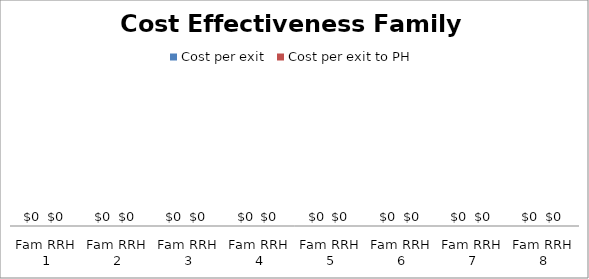
| Category | Cost per exit | Cost per exit to PH |
|---|---|---|
| Fam RRH 1 | 0 | 0 |
| Fam RRH 2 | 0 | 0 |
| Fam RRH 3 | 0 | 0 |
| Fam RRH 4 | 0 | 0 |
| Fam RRH 5 | 0 | 0 |
| Fam RRH 6 | 0 | 0 |
| Fam RRH 7 | 0 | 0 |
| Fam RRH 8 | 0 | 0 |